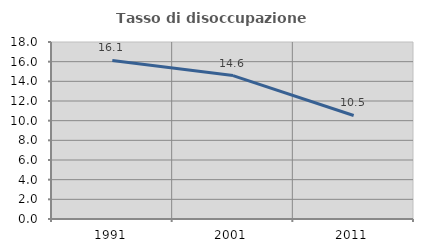
| Category | Tasso di disoccupazione giovanile  |
|---|---|
| 1991.0 | 16.129 |
| 2001.0 | 14.583 |
| 2011.0 | 10.526 |